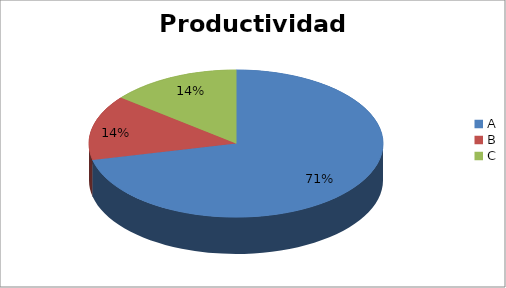
| Category | Series 0 |
|---|---|
| A | 71.429 |
| B | 14.286 |
| C | 14.286 |